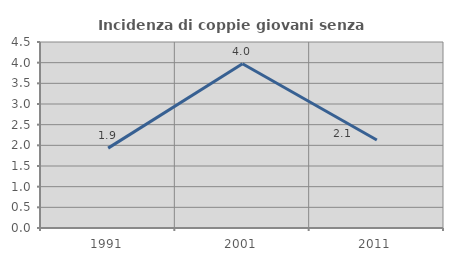
| Category | Incidenza di coppie giovani senza figli |
|---|---|
| 1991.0 | 1.932 |
| 2001.0 | 3.974 |
| 2011.0 | 2.128 |